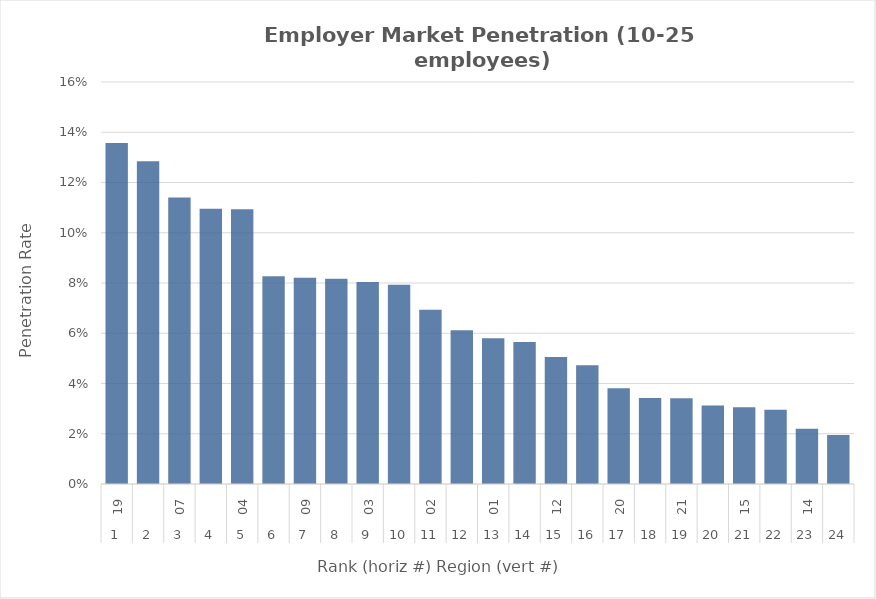
| Category | Rate |
|---|---|
| 0 | 0.136 |
| 1 | 0.128 |
| 2 | 0.114 |
| 3 | 0.11 |
| 4 | 0.109 |
| 5 | 0.083 |
| 6 | 0.082 |
| 7 | 0.082 |
| 8 | 0.08 |
| 9 | 0.079 |
| 10 | 0.069 |
| 11 | 0.061 |
| 12 | 0.058 |
| 13 | 0.057 |
| 14 | 0.051 |
| 15 | 0.047 |
| 16 | 0.038 |
| 17 | 0.034 |
| 18 | 0.034 |
| 19 | 0.031 |
| 20 | 0.031 |
| 21 | 0.03 |
| 22 | 0.022 |
| 23 | 0.02 |